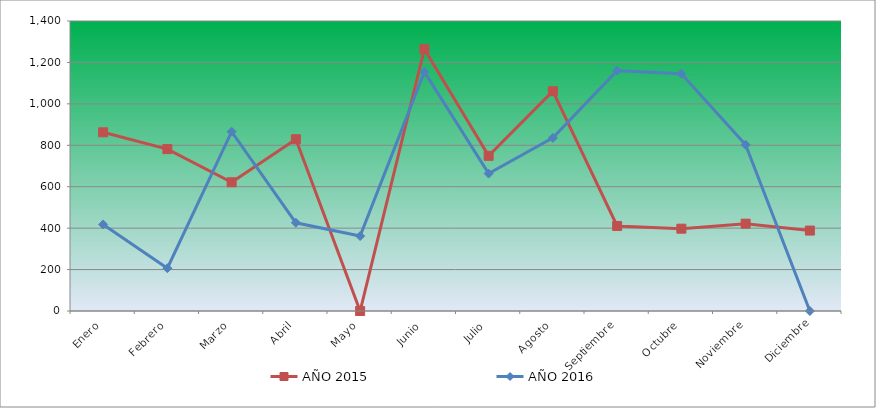
| Category | AÑO 2015 | AÑO 2016 |
|---|---|---|
| Enero | 862.665 | 417.857 |
| Febrero | 781.568 | 206.424 |
| Marzo | 621.403 | 865.776 |
| Abril | 829.213 | 425.874 |
| Mayo | 0 | 361.742 |
| Junio | 1264.093 | 1154.369 |
| Julio | 749.13 | 663.361 |
| Agosto | 1061.352 | 835.715 |
| Septiembre | 410.551 | 1160.381 |
| Octubre | 397.373 | 1145.35 |
| Noviembre | 421.702 | 802.647 |
| Diciembre | 388.25 | 0 |